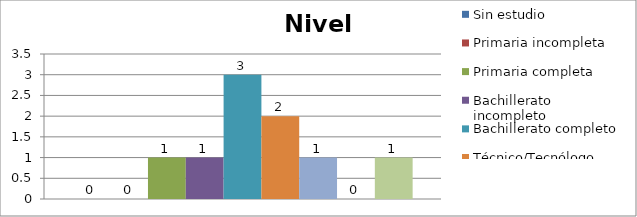
| Category | Sin estudio | Primaria incompleta | Primaria completa | Bachillerato incompleto | Bachillerato completo | Técnico/Tecnólogo | Universitario | Post-grado | Especialización |
|---|---|---|---|---|---|---|---|---|---|
| 0 | 0 | 0 | 1 | 1 | 3 | 2 | 1 | 0 | 1 |